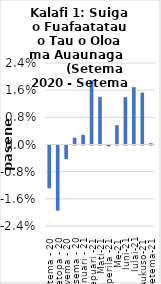
| Category | All items - m-m changes |
|---|---|
| Setema - 20 | -0.013 |
| Oketopa - 20 | -0.019 |
| Novema - 20 | -0.004 |
| Tesema - 20 | 0.002 |
| Ianuari - 21 | 0.003 |
| Fepuari -21 | 0.019 |
| Mati-21 | 0.014 |
| Aperila -21 | 0 |
| Me-21 | 0.006 |
| Iuni-21 | 0.014 |
| Iulai-21 | 0.017 |
| Aukuso-21 | 0.015 |
| Setema-21 | 0 |